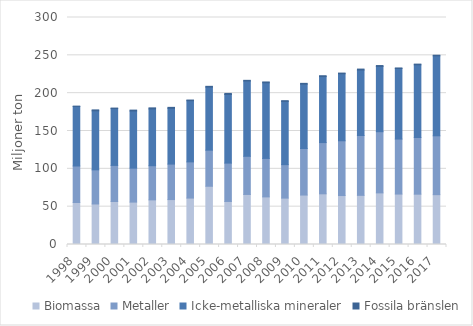
| Category | Biomassa | Metaller | Icke-metalliska mineraler | Fossila bränslen |
|---|---|---|---|---|
| 1998.0 | 55.507 | 48.234 | 78.756 | 0.319 |
| 1999.0 | 53.56 | 45.113 | 77.989 | 1.234 |
| 2000.0 | 56.799 | 47.732 | 75.055 | 0.712 |
| 2001.0 | 56.024 | 44.862 | 75.561 | 1.169 |
| 2002.0 | 58.966 | 45.156 | 75.047 | 1.406 |
| 2003.0 | 59.375 | 46.889 | 73.732 | 1.243 |
| 2004.0 | 61.355 | 47.83 | 80.845 | 0.894 |
| 2005.0 | 76.978 | 47.687 | 83.378 | 1 |
| 2006.0 | 56.887 | 50.691 | 90.646 | 1.427 |
| 2007.0 | 66.138 | 50.466 | 99.471 | 0.878 |
| 2008.0 | 62.923 | 50.844 | 99.977 | 1.071 |
| 2009.0 | 61.314 | 44.222 | 83.551 | 1.002 |
| 2010.0 | 65.34 | 61.516 | 85.067 | 1.039 |
| 2011.0 | 66.991 | 67.717 | 87.229 | 1.125 |
| 2012.0 | 64.711 | 72.374 | 88.61 | 0.847 |
| 2013.0 | 64.959 | 79.086 | 86.528 | 1.255 |
| 2014.0 | 68.225 | 80.836 | 86.326 | 1.112 |
| 2015.0 | 66.658 | 72.694 | 93.26 | 0.718 |
| 2016.0 | 66.511 | 74.864 | 96.106 | 0.925 |
| 2017.0 | 65.866 | 77.785 | 105.67 | 0.825 |